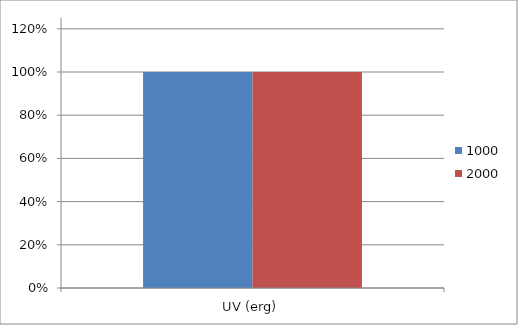
| Category | No drug | 1000 | 2000 |
|---|---|---|---|
| 0 |  | 1 | 1 |